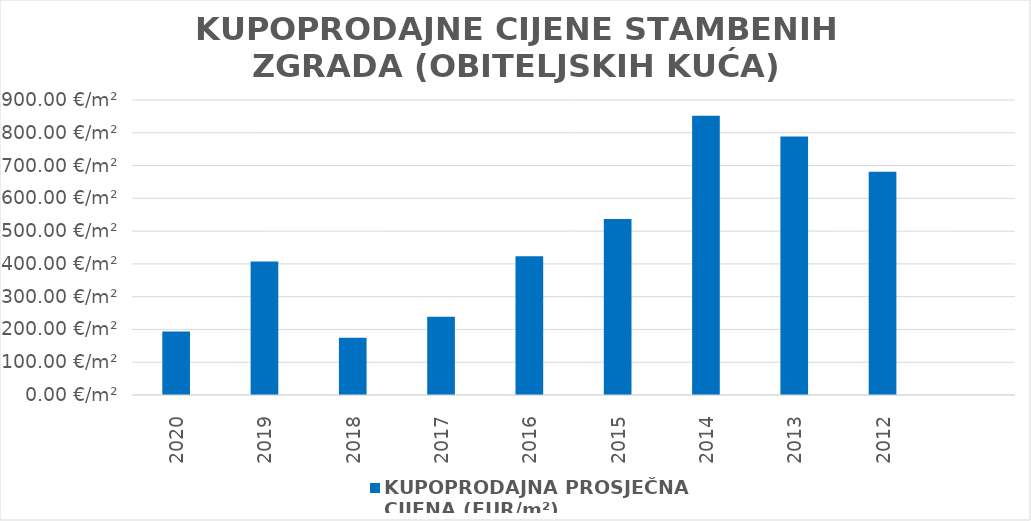
| Category | KUPOPRODAJNA PROSJEČNA 
CIJENA (EUR/m²) |
|---|---|
| 2020 | 1900-07-11 10:50:00 |
| 2019 | 1901-02-10 12:53:41 |
| 2018 | 1900-06-22 10:11:02 |
| 2017 | 1900-08-25 20:39:07 |
| 2016 | 1901-02-26 06:22:35 |
| 2015 | 1901-06-20 03:26:08 |
| 2014 | 1902-05-01 00:13:44 |
| 2013 | 1902-02-26 09:31:35 |
| 2012 | 1901-11-11 02:07:59 |